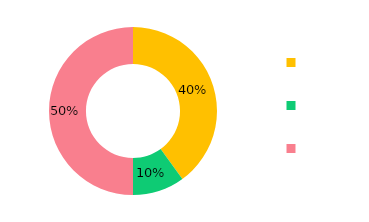
| Category | Total |
|---|---|
| BTC | 0.4 |
| DOGE | 0.1 |
| XMR | 0.5 |